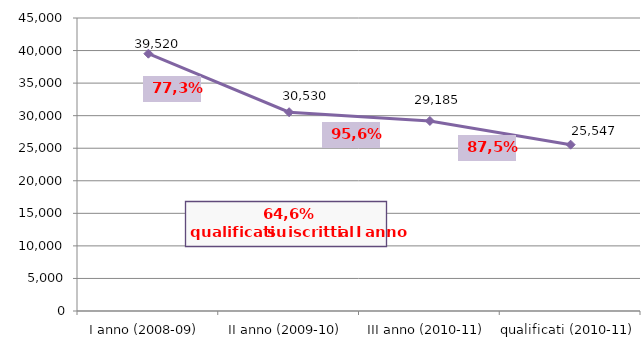
| Category | Series 0 |
|---|---|
| I anno (2008-09) | 39520 |
| II anno (2009-10) | 30530 |
| III anno (2010-11) | 29185 |
| qualificati (2010-11) | 25547 |